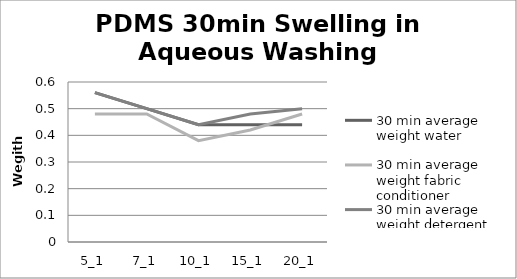
| Category | 30 min average weight water | 30 min average weight fabric conditioner | 30 min average weight detergent |
|---|---|---|---|
| 5_1 | 0.56 | 0.48 | 0.56 |
| 7_1 | 0.5 | 0.48 | 0.5 |
| 10_1 | 0.44 | 0.38 | 0.44 |
| 15_1 | 0.44 | 0.42 | 0.48 |
| 20_1 | 0.44 | 0.48 | 0.5 |